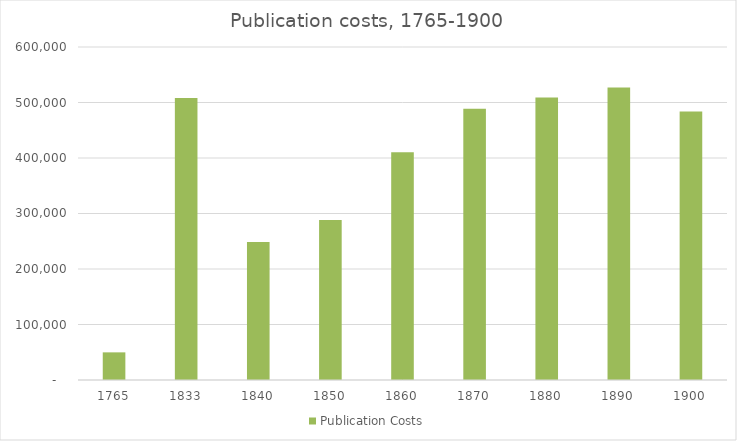
| Category | Publication Costs |
|---|---|
| 1765.0 | 49796 |
| 1833.0 | 508319 |
| 1840.0 | 248676 |
| 1850.0 | 288123 |
| 1860.0 | 410136 |
| 1870.0 | 488814 |
| 1880.0 | 509215 |
| 1890.0 | 527234 |
| 1900.0 | 483972 |